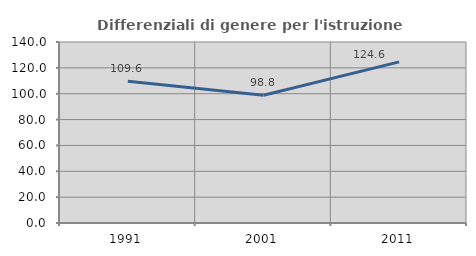
| Category | Differenziali di genere per l'istruzione superiore |
|---|---|
| 1991.0 | 109.63 |
| 2001.0 | 98.773 |
| 2011.0 | 124.615 |